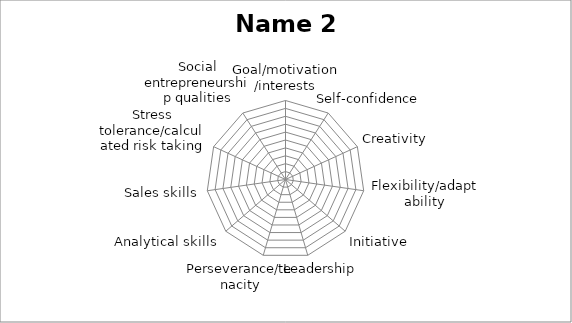
| Category | Series 0 |
|---|---|
| Goal/motivation/interests | 0 |
| Self-confidence | 0 |
| Creativity | 0 |
| Flexibility/adaptability | 0 |
| Initiative | 0 |
| Leadership  | 0 |
| Perseverance/tenacity | 0 |
| Analytical skills | 0 |
| Sales skills | 0 |
| Stress tolerance/calculated risk taking | 0 |
| Social entrepreneurship qualities | 0 |